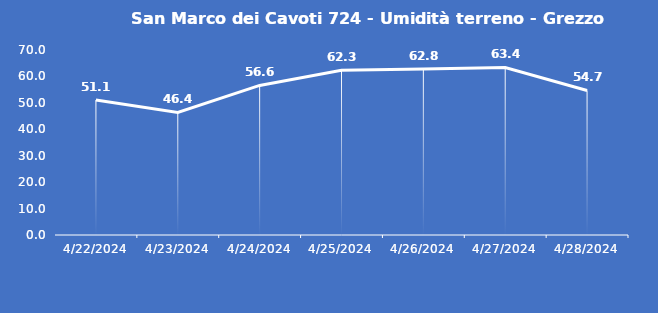
| Category | San Marco dei Cavoti 724 - Umidità terreno - Grezzo (%VWC) |
|---|---|
| 4/22/24 | 51.1 |
| 4/23/24 | 46.4 |
| 4/24/24 | 56.6 |
| 4/25/24 | 62.3 |
| 4/26/24 | 62.8 |
| 4/27/24 | 63.4 |
| 4/28/24 | 54.7 |